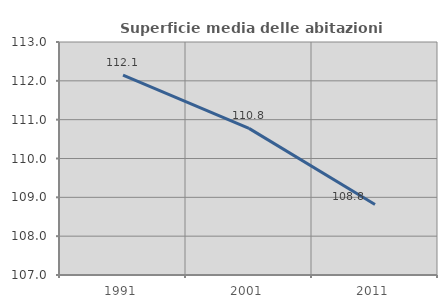
| Category | Superficie media delle abitazioni occupate |
|---|---|
| 1991.0 | 112.149 |
| 2001.0 | 110.776 |
| 2011.0 | 108.817 |